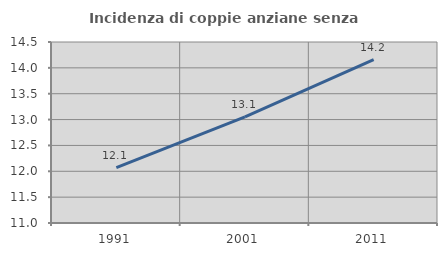
| Category | Incidenza di coppie anziane senza figli  |
|---|---|
| 1991.0 | 12.072 |
| 2001.0 | 13.052 |
| 2011.0 | 14.158 |